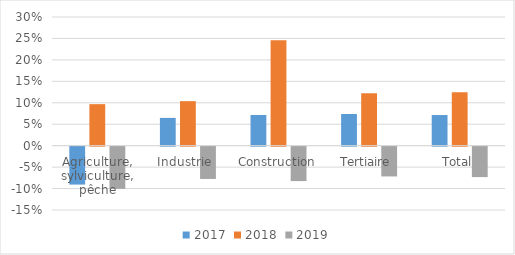
| Category | 2017 | 2018 | 2019 |
|---|---|---|---|
| Agriculture, sylviculture, pêche | -0.088 | 0.097 | -0.098 |
| Industrie  | 0.065 | 0.104 | -0.075 |
| Construction | 0.072 | 0.246 | -0.08 |
| Tertiaire  | 0.074 | 0.122 | -0.069 |
| Total | 0.071 | 0.125 | -0.071 |